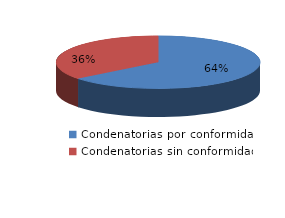
| Category | Series 0 |
|---|---|
| 0 | 475 |
| 1 | 264 |